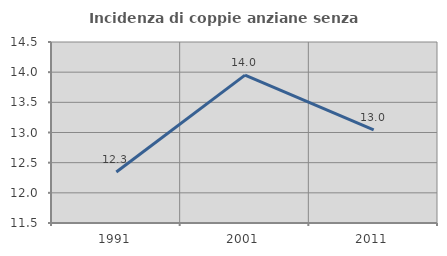
| Category | Incidenza di coppie anziane senza figli  |
|---|---|
| 1991.0 | 12.345 |
| 2001.0 | 13.951 |
| 2011.0 | 13.043 |